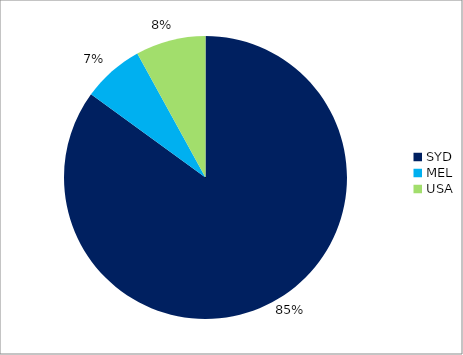
| Category | Series 0 |
|---|---|
| SYD | 0.85 |
| MEL | 0.07 |
| USA | 0.08 |